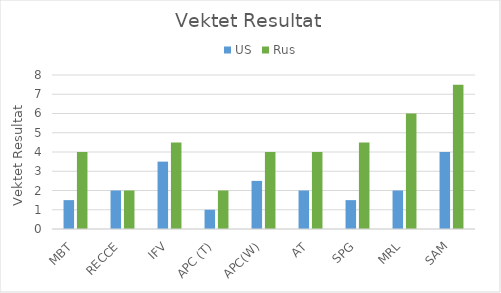
| Category | US | Rus |
|---|---|---|
| MBT | 1.5 | 4 |
| RECCE | 2 | 2 |
| IFV | 3.5 | 4.5 |
| APC (T) | 1 | 2 |
| APC(W) | 2.5 | 4 |
| AT | 2 | 4 |
| SPG | 1.5 | 4.5 |
| MRL | 2 | 6 |
| SAM | 4 | 7.5 |